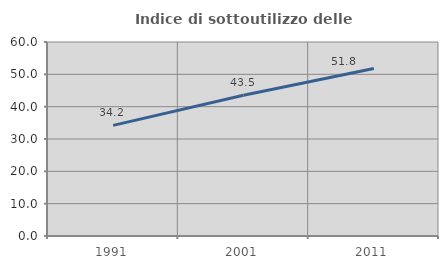
| Category | Indice di sottoutilizzo delle abitazioni  |
|---|---|
| 1991.0 | 34.223 |
| 2001.0 | 43.511 |
| 2011.0 | 51.815 |